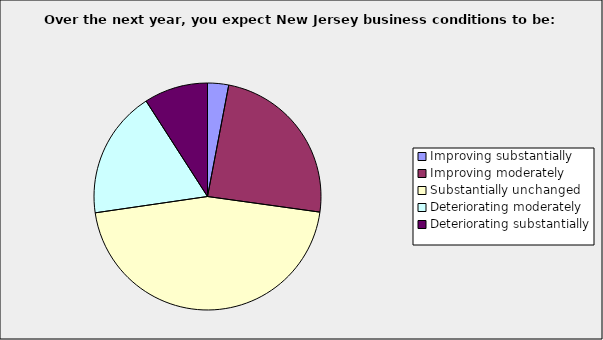
| Category | Series 0 |
|---|---|
| Improving substantially | 0.03 |
| Improving moderately | 0.242 |
| Substantially unchanged | 0.455 |
| Deteriorating moderately | 0.182 |
| Deteriorating substantially | 0.091 |